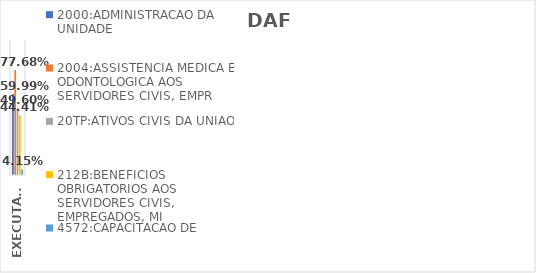
| Category | 2000:ADMINISTRACAO DA UNIDADE | 2004:ASSISTENCIA MEDICA E ODONTOLOGICA AOS SERVIDORES CIVIS, EMPR | 20TP:ATIVOS CIVIS DA UNIAO | 212B:BENEFICIOS OBRIGATORIOS AOS SERVIDORES CIVIS, EMPREGADOS, MI | 4572:CAPACITACAO DE SERVIDORES PUBLICOS FEDERAIS EM PROCESSO DE Q |
|---|---|---|---|---|---|
| EXECUTADO | 0.6 | 0.777 | 0.496 | 0.444 | 0.042 |